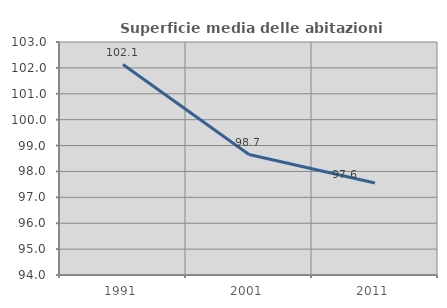
| Category | Superficie media delle abitazioni occupate |
|---|---|
| 1991.0 | 102.13 |
| 2001.0 | 98.652 |
| 2011.0 | 97.555 |